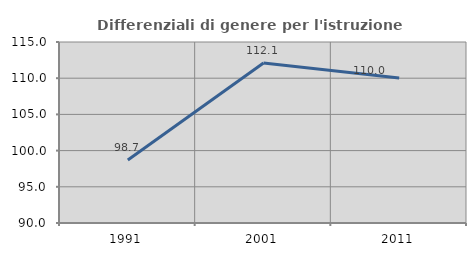
| Category | Differenziali di genere per l'istruzione superiore |
|---|---|
| 1991.0 | 98.702 |
| 2001.0 | 112.093 |
| 2011.0 | 110.034 |